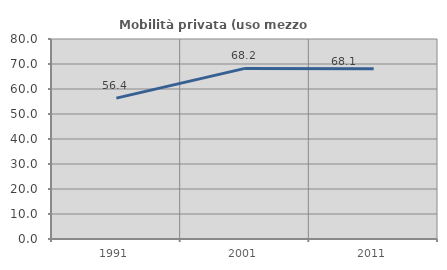
| Category | Mobilità privata (uso mezzo privato) |
|---|---|
| 1991.0 | 56.363 |
| 2001.0 | 68.249 |
| 2011.0 | 68.113 |